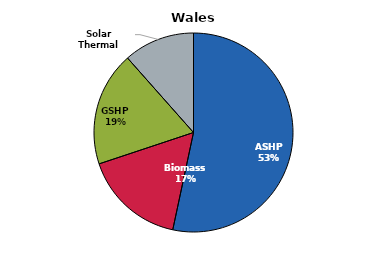
| Category | Wales |
|---|---|
| ASHP | 4004 |
| Biomass | 1242 |
| GSHP | 1394 |
| Solar Thermal | 866 |